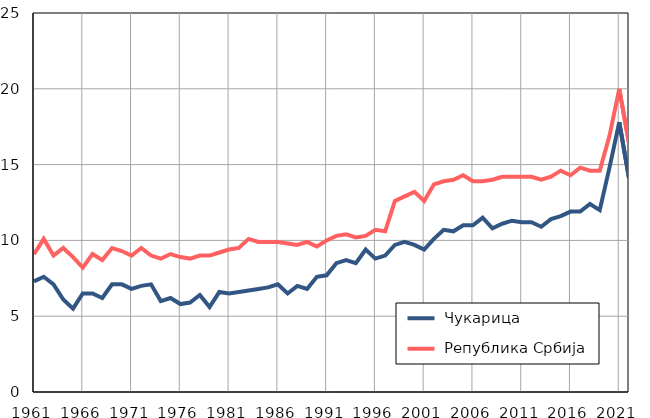
| Category |  Чукарица |  Република Србија |
|---|---|---|
| 1961.0 | 7.3 | 9.1 |
| 1962.0 | 7.6 | 10.1 |
| 1963.0 | 7.1 | 9 |
| 1964.0 | 6.1 | 9.5 |
| 1965.0 | 5.5 | 8.9 |
| 1966.0 | 6.5 | 8.2 |
| 1967.0 | 6.5 | 9.1 |
| 1968.0 | 6.2 | 8.7 |
| 1969.0 | 7.1 | 9.5 |
| 1970.0 | 7.1 | 9.3 |
| 1971.0 | 6.8 | 9 |
| 1972.0 | 7 | 9.5 |
| 1973.0 | 7.1 | 9 |
| 1974.0 | 6 | 8.8 |
| 1975.0 | 6.2 | 9.1 |
| 1976.0 | 5.8 | 8.9 |
| 1977.0 | 5.9 | 8.8 |
| 1978.0 | 6.4 | 9 |
| 1979.0 | 5.6 | 9 |
| 1980.0 | 6.6 | 9.2 |
| 1981.0 | 6.5 | 9.4 |
| 1982.0 | 6.6 | 9.5 |
| 1983.0 | 6.7 | 10.1 |
| 1984.0 | 6.8 | 9.9 |
| 1985.0 | 6.9 | 9.9 |
| 1986.0 | 7.1 | 9.9 |
| 1987.0 | 6.5 | 9.8 |
| 1988.0 | 7 | 9.7 |
| 1989.0 | 6.8 | 9.9 |
| 1990.0 | 7.6 | 9.6 |
| 1991.0 | 7.7 | 10 |
| 1992.0 | 8.5 | 10.3 |
| 1993.0 | 8.7 | 10.4 |
| 1994.0 | 8.5 | 10.2 |
| 1995.0 | 9.4 | 10.3 |
| 1996.0 | 8.8 | 10.7 |
| 1997.0 | 9 | 10.6 |
| 1998.0 | 9.7 | 12.6 |
| 1999.0 | 9.9 | 12.9 |
| 2000.0 | 9.7 | 13.2 |
| 2001.0 | 9.4 | 12.6 |
| 2002.0 | 10.1 | 13.7 |
| 2003.0 | 10.7 | 13.9 |
| 2004.0 | 10.6 | 14 |
| 2005.0 | 11 | 14.3 |
| 2006.0 | 11 | 13.9 |
| 2007.0 | 11.5 | 13.9 |
| 2008.0 | 10.8 | 14 |
| 2009.0 | 11.1 | 14.2 |
| 2010.0 | 11.3 | 14.2 |
| 2011.0 | 11.2 | 14.2 |
| 2012.0 | 11.2 | 14.2 |
| 2013.0 | 10.9 | 14 |
| 2014.0 | 11.4 | 14.2 |
| 2015.0 | 11.6 | 14.6 |
| 2016.0 | 11.9 | 14.3 |
| 2017.0 | 11.9 | 14.8 |
| 2018.0 | 12.4 | 14.6 |
| 2019.0 | 12 | 14.6 |
| 2020.0 | 14.8 | 16.9 |
| 2021.0 | 17.8 | 20 |
| 2022.0 | 14.1 | 16.4 |